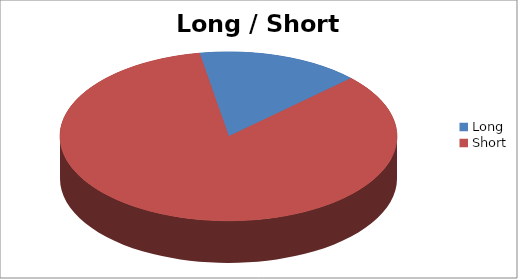
| Category | Long / Short Entries |
|---|---|
| Long | 8 |
| Short | 43 |